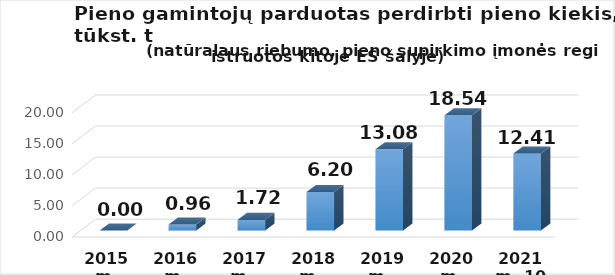
| Category | Kitoje ES šalyje registruotam ūkio subjektui  |
|---|---|
| 2015 m. | 0 |
| 2016 m. | 0.96 |
| 2017 m.  | 1.72 |
| 2018 m.  | 6.2 |
| 2019 m.  | 13.08 |
| 2020 m. | 18.54 |
| 2021 m. 10 mėn. | 12.413 |